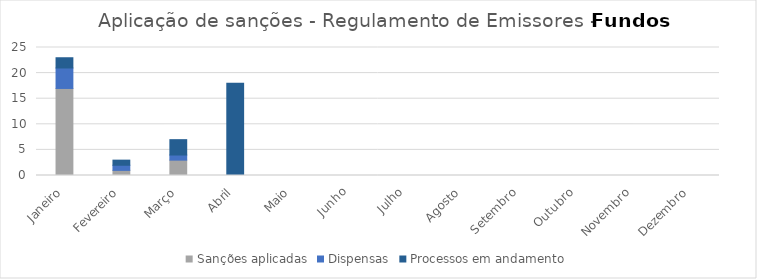
| Category | Sanções aplicadas | Dispensas | Processos em andamento |
|---|---|---|---|
| Janeiro | 17 | 4 | 2 |
| Fevereiro | 1 | 1 | 1 |
| Março | 3 | 1 | 3 |
| Abril | 0 | 0 | 18 |
| Maio | 0 | 0 | 0 |
| Junho | 0 | 0 | 0 |
| Julho | 0 | 0 | 0 |
| Agosto | 0 | 0 | 0 |
| Setembro | 0 | 0 | 0 |
| Outubro | 0 | 0 | 0 |
| Novembro | 0 | 0 | 0 |
| Dezembro | 0 | 0 | 0 |